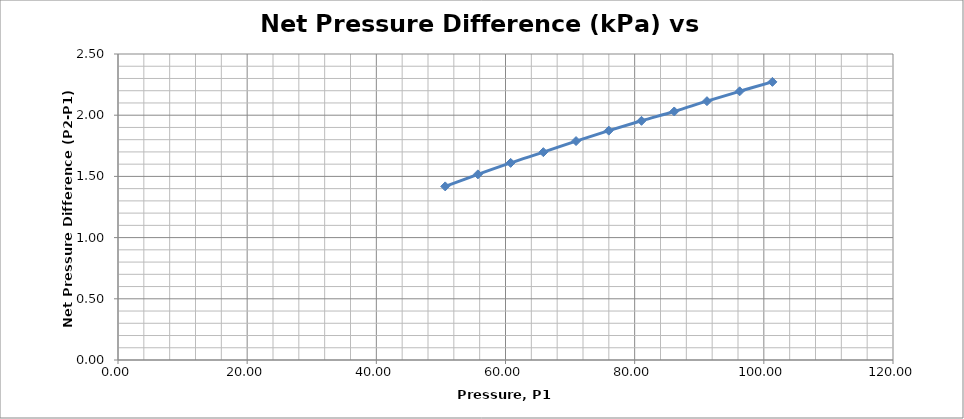
| Category | Series 0 |
|---|---|
| 50.6625 | 1.418 |
| 55.72875 | 1.517 |
| 60.795 | 1.61 |
| 65.86125 | 1.698 |
| 70.9275 | 1.789 |
| 75.99375 | 1.874 |
| 81.06 | 1.954 |
| 86.12625 | 2.03 |
| 91.1925 | 2.115 |
| 96.25875 | 2.195 |
| 101.325 | 2.272 |